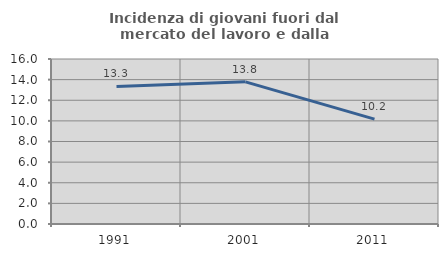
| Category | Incidenza di giovani fuori dal mercato del lavoro e dalla formazione  |
|---|---|
| 1991.0 | 13.342 |
| 2001.0 | 13.785 |
| 2011.0 | 10.165 |